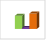
| Category | област Габрово |
|---|---|
| летен сезон 2019  | 96701 |
| летен сезон 2021  | 86035 |
| летен сезон 2022 г.  | 98683 |